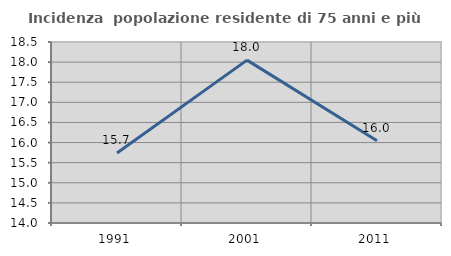
| Category | Incidenza  popolazione residente di 75 anni e più |
|---|---|
| 1991.0 | 15.741 |
| 2001.0 | 18.049 |
| 2011.0 | 16.043 |